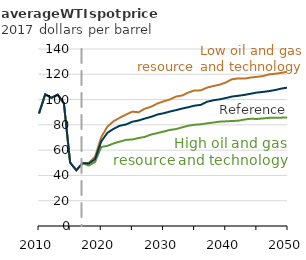
| Category | High oil and gas resource and technology | Low oil and gas resource and technology | Reference |
|---|---|---|---|
| 2010.0 | 89.045 | 89.045 | 89.045 |
| 2011.0 | 104.138 | 104.138 | 104.138 |
| 2012.0 | 101.373 | 101.373 | 101.373 |
| 2013.0 | 103.905 | 103.905 | 103.905 |
| 2014.0 | 97.058 | 97.058 | 97.058 |
| 2015.0 | 50.154 | 50.154 | 50.154 |
| 2016.0 | 44.09 | 44.09 | 44.09 |
| 2017.0 | 49.686 | 49.686 | 49.686 |
| 2018.0 | 47.822 | 49.825 | 49.47 |
| 2019.0 | 50.609 | 54.712 | 52.819 |
| 2020.0 | 62.488 | 70.267 | 66.934 |
| 2021.0 | 63.403 | 78.656 | 73.743 |
| 2022.0 | 65.327 | 82.943 | 76.929 |
| 2023.0 | 66.772 | 85.663 | 79.325 |
| 2024.0 | 68.137 | 88.208 | 80.336 |
| 2025.0 | 68.458 | 90.451 | 82.498 |
| 2026.0 | 69.569 | 89.993 | 83.447 |
| 2027.0 | 70.484 | 92.779 | 84.995 |
| 2028.0 | 72.326 | 94.288 | 86.325 |
| 2029.0 | 73.481 | 96.862 | 88.143 |
| 2030.0 | 74.664 | 98.574 | 89.16 |
| 2031.0 | 75.943 | 100.055 | 90.486 |
| 2032.0 | 76.661 | 102.347 | 91.634 |
| 2033.0 | 78.037 | 103.244 | 92.888 |
| 2034.0 | 79.349 | 105.591 | 93.978 |
| 2035.0 | 80.096 | 107.249 | 95.191 |
| 2036.0 | 80.449 | 107.279 | 95.823 |
| 2037.0 | 81.196 | 109.477 | 98.292 |
| 2038.0 | 81.824 | 110.703 | 99.405 |
| 2039.0 | 82.525 | 111.741 | 100.181 |
| 2040.0 | 82.77 | 113.513 | 101.193 |
| 2041.0 | 83.041 | 116.079 | 102.406 |
| 2042.0 | 83.27 | 116.738 | 103.004 |
| 2043.0 | 84.213 | 116.574 | 103.696 |
| 2044.0 | 84.846 | 117.424 | 104.643 |
| 2045.0 | 84.658 | 117.974 | 105.542 |
| 2046.0 | 85.105 | 118.595 | 106.074 |
| 2047.0 | 85.577 | 119.965 | 106.722 |
| 2048.0 | 85.662 | 120.471 | 107.62 |
| 2049.0 | 85.719 | 121.132 | 108.746 |
| 2050.0 | 85.934 | 122.174 | 109.533 |